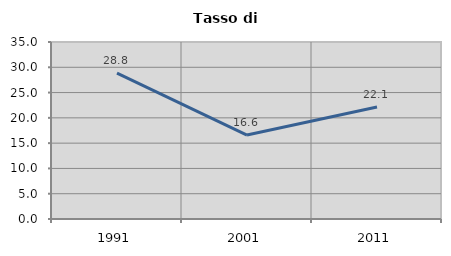
| Category | Tasso di disoccupazione   |
|---|---|
| 1991.0 | 28.84 |
| 2001.0 | 16.599 |
| 2011.0 | 22.143 |